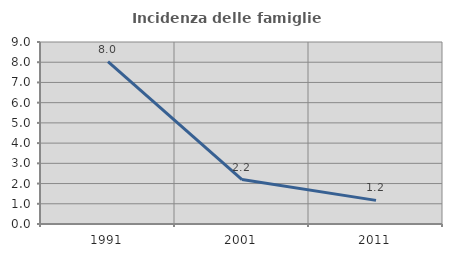
| Category | Incidenza delle famiglie numerose |
|---|---|
| 1991.0 | 8.029 |
| 2001.0 | 2.199 |
| 2011.0 | 1.169 |